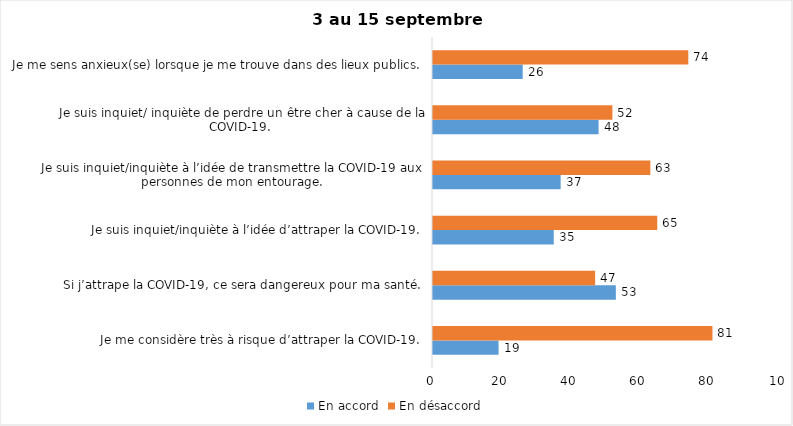
| Category | En accord | En désaccord |
|---|---|---|
| Je me considère très à risque d’attraper la COVID-19. | 19 | 81 |
| Si j’attrape la COVID-19, ce sera dangereux pour ma santé. | 53 | 47 |
| Je suis inquiet/inquiète à l’idée d’attraper la COVID-19. | 35 | 65 |
| Je suis inquiet/inquiète à l’idée de transmettre la COVID-19 aux personnes de mon entourage. | 37 | 63 |
| Je suis inquiet/ inquiète de perdre un être cher à cause de la COVID-19. | 48 | 52 |
| Je me sens anxieux(se) lorsque je me trouve dans des lieux publics. | 26 | 74 |